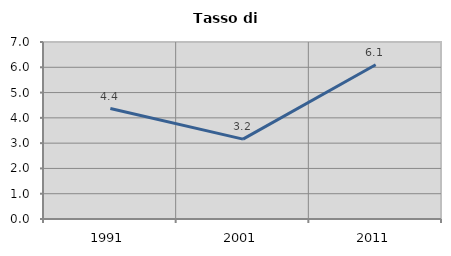
| Category | Tasso di disoccupazione   |
|---|---|
| 1991.0 | 4.369 |
| 2001.0 | 3.16 |
| 2011.0 | 6.098 |